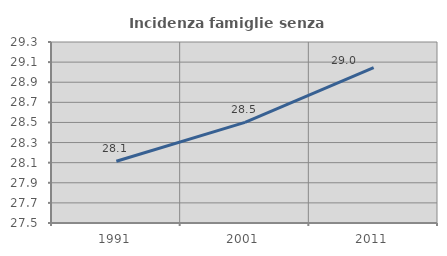
| Category | Incidenza famiglie senza nuclei |
|---|---|
| 1991.0 | 28.114 |
| 2001.0 | 28.501 |
| 2011.0 | 29.046 |